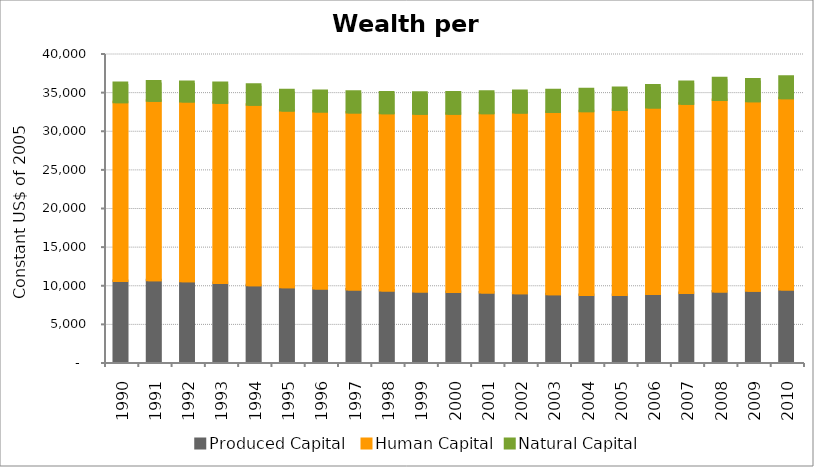
| Category | Produced Capital  | Human Capital | Natural Capital |
|---|---|---|---|
| 1990.0 | 10490.961 | 23140.68 | 2477.985 |
| 1991.0 | 10597.679 | 23209.927 | 2504.742 |
| 1992.0 | 10457.818 | 23269.301 | 2532.937 |
| 1993.0 | 10230.171 | 23314.279 | 2562.167 |
| 1994.0 | 9949.042 | 23350.012 | 2591.375 |
| 1995.0 | 9692.229 | 22852.527 | 2619.613 |
| 1996.0 | 9519.324 | 22910.372 | 2646.669 |
| 1997.0 | 9372.218 | 22936.322 | 2671.404 |
| 1998.0 | 9245.384 | 22956.339 | 2697.405 |
| 1999.0 | 9140.97 | 22998.477 | 2721.662 |
| 2000.0 | 9069.151 | 23071.675 | 2744.413 |
| 2001.0 | 8990.428 | 23217.526 | 2763.972 |
| 2002.0 | 8886.875 | 23395.104 | 2784.289 |
| 2003.0 | 8770.301 | 23593.623 | 2802.511 |
| 2004.0 | 8681.4 | 23792.359 | 2821.365 |
| 2005.0 | 8659.433 | 23973.391 | 2843.585 |
| 2006.0 | 8793.895 | 24152.305 | 2831.947 |
| 2007.0 | 8939.982 | 24477.103 | 2821.797 |
| 2008.0 | 9122.441 | 24789.951 | 2811.036 |
| 2009.0 | 9216.906 | 24537.36 | 2802.613 |
| 2010.0 | 9373.209 | 24775.134 | 2792.731 |